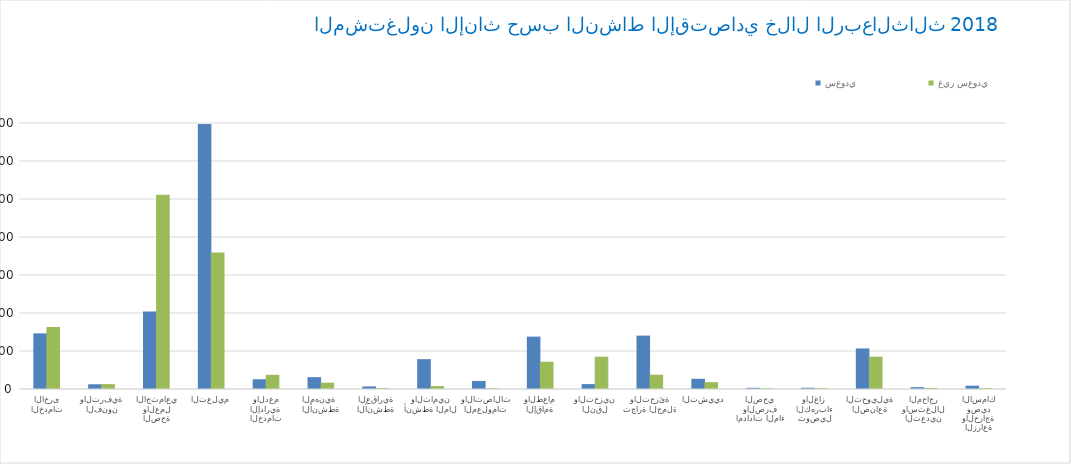
| Category | سعودي   | غير سعودي  |
|---|---|---|
| الزراعة والحراجة وصيد الأسماك | 869 | 238 |
| التعدين واستغلال المحاجر | 482 | 277 |
| الصناعة التحويلية | 10664 | 8515 |
| توصيل الكهرباء والغاز  | 323 | 215 |
| امدادات الماء والصرف الصحي | 313 | 173 |
| التشييد | 2688 | 1807 |
| تجارة الجملة والتجزئة | 14051 | 3766 |
| النقل والتخزين | 1289 | 8495 |
| الإقامة والطعام | 13784 | 7183 |
| المعلومات والاتصالات | 2117 | 198 |
| أنشطة المال والتأمين | 7849 | 765 |
| الأنشطة العقارية | 679 | 233 |
| الأنشطة المهنية  | 3115 | 1662 |
| الخدمات الإدارية والدعم | 2561 | 3728 |
| التعليم | 69763 | 35930 |
| الصحة والعمل الاجتماعي | 20422 | 51125 |
| الفنون والترفية | 1241 | 1288 |
| الخدمات الأخرى | 14638 | 16320 |